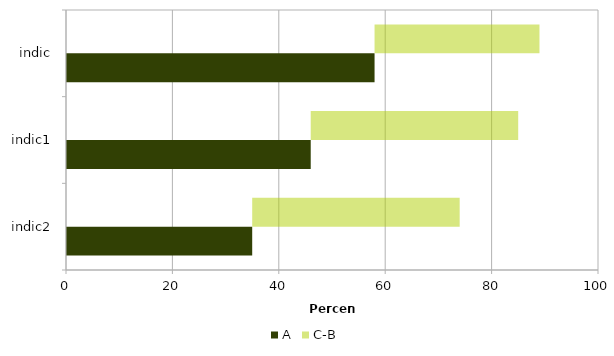
| Category | A | C-B |
|---|---|---|
| indic2 | 35 | 39 |
| indic1 | 46 | 39 |
| indic | 58 | 31 |